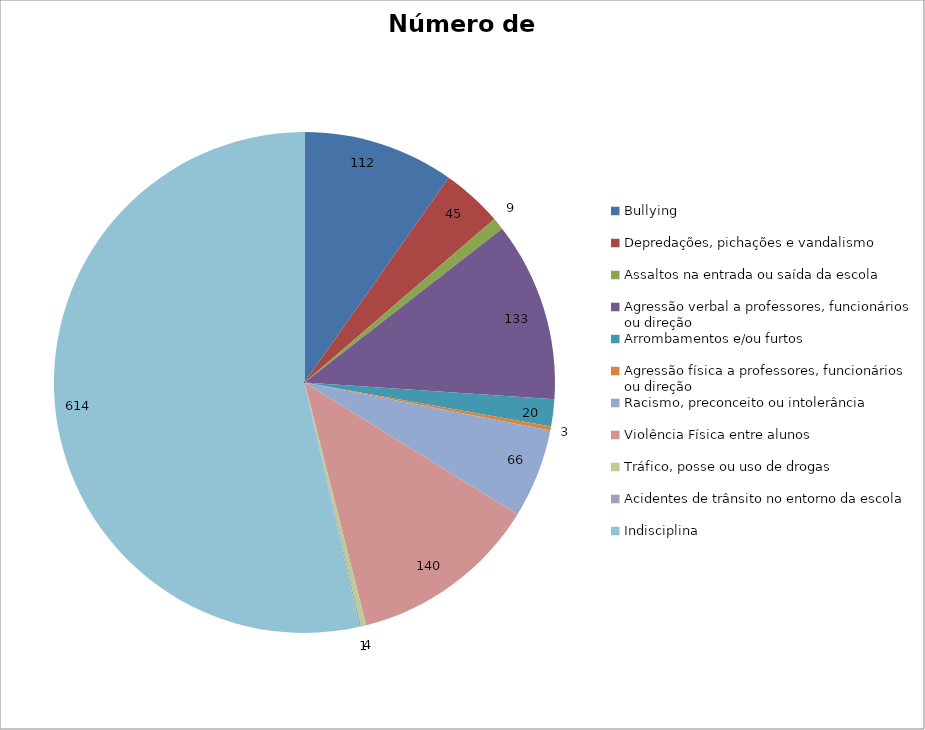
| Category | Número de Casos |
|---|---|
| Bullying | 112 |
| Depredações, pichações e vandalismo | 45 |
| Assaltos na entrada ou saída da escola | 9 |
| Agressão verbal a professores, funcionários ou direção | 133 |
| Arrombamentos e/ou furtos | 20 |
| Agressão física a professores, funcionários ou direção | 3 |
| Racismo, preconceito ou intolerância | 66 |
| Violência Física entre alunos | 140 |
| Tráfico, posse ou uso de drogas | 4 |
| Acidentes de trânsito no entorno da escola | 1 |
| Indisciplina | 614 |